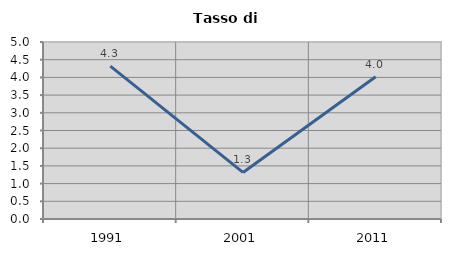
| Category | Tasso di disoccupazione   |
|---|---|
| 1991.0 | 4.317 |
| 2001.0 | 1.316 |
| 2011.0 | 4.02 |